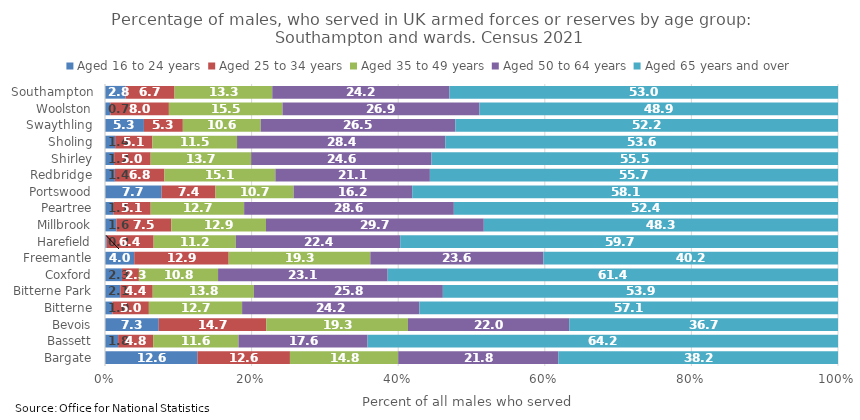
| Category | Aged 16 to 24 years | Aged 25 to 34 years | Aged 35 to 49 years | Aged 50 to 64 years | Aged 65 years and over |
|---|---|---|---|---|---|
| Bargate | 12.615 | 12.615 | 14.769 | 21.846 | 38.154 |
| Bassett | 1.791 | 4.776 | 11.642 | 17.612 | 64.179 |
| Bevois | 7.333 | 14.667 | 19.333 | 22 | 36.667 |
| Bitterne | 0.998 | 4.988 | 12.718 | 24.19 | 57.107 |
| Bitterne Park | 2.083 | 4.427 | 13.802 | 25.781 | 53.906 |
| Coxford | 2.314 | 2.314 | 10.797 | 23.136 | 61.44 |
| Freemantle | 3.988 | 12.883 | 19.325 | 23.62 | 40.184 |
| Harefield | 0.229 | 6.407 | 11.213 | 22.426 | 59.725 |
| Millbrook | 1.55 | 7.494 | 12.92 | 29.716 | 48.32 |
| Peartree | 1.133 | 5.099 | 12.748 | 28.612 | 52.408 |
| Portswood | 7.721 | 7.353 | 10.662 | 16.176 | 58.088 |
| Redbridge | 1.351 | 6.757 | 15.135 | 21.081 | 55.676 |
| Shirley | 1.246 | 4.984 | 13.707 | 24.611 | 55.452 |
| Sholing | 1.386 | 5.081 | 11.547 | 28.406 | 53.58 |
| Swaythling | 5.31 | 5.31 | 10.619 | 26.549 | 52.212 |
| Woolston | 0.726 | 7.99 | 15.496 | 26.877 | 48.91 |
| Southampton | 2.789 | 6.7 | 13.329 | 24.176 | 53.006 |